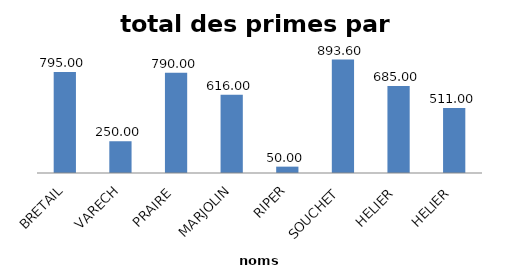
| Category | total des primes |
|---|---|
| BRETAIL | 795 |
| VARECH | 250 |
| PRAIRE | 790 |
| MARJOLIN | 616 |
| RIPER | 50 |
| SOUCHET | 893.6 |
| HELIER | 685 |
| HELIER | 511 |